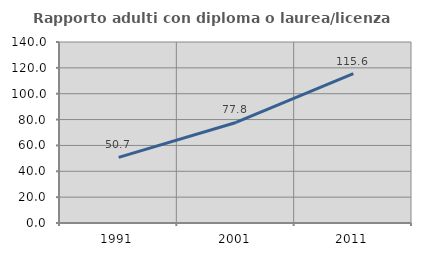
| Category | Rapporto adulti con diploma o laurea/licenza media  |
|---|---|
| 1991.0 | 50.75 |
| 2001.0 | 77.758 |
| 2011.0 | 115.589 |